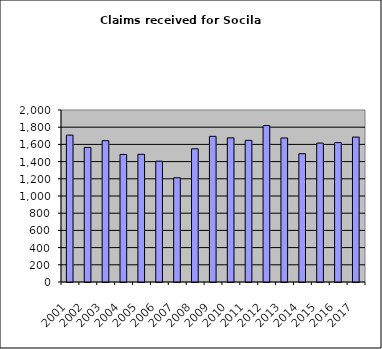
| Category | Series 0 |
|---|---|
| 2001.0 | 1708 |
| 2002.0 | 1565 |
| 2003.0 | 1643 |
| 2004.0 | 1483 |
| 2005.0 | 1485 |
| 2006.0 | 1405 |
| 2007.0 | 1212 |
| 2008.0 | 1549 |
| 2009.0 | 1694 |
| 2010.0 | 1676 |
| 2011.0 | 1647 |
| 2012.0 | 1819 |
| 2013.0 | 1675 |
| 2014.0 | 1492 |
| 2015.0 | 1615 |
| 2016.0 | 1621 |
| 2017.0 | 1685 |